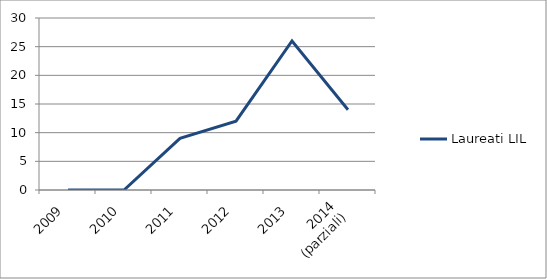
| Category | Laureati LIL |
|---|---|
| 2009 | 0 |
| 2010 | 0 |
| 2011 | 9 |
| 2012 | 12 |
| 2013 | 26 |
| 2014
(parziali) | 14 |